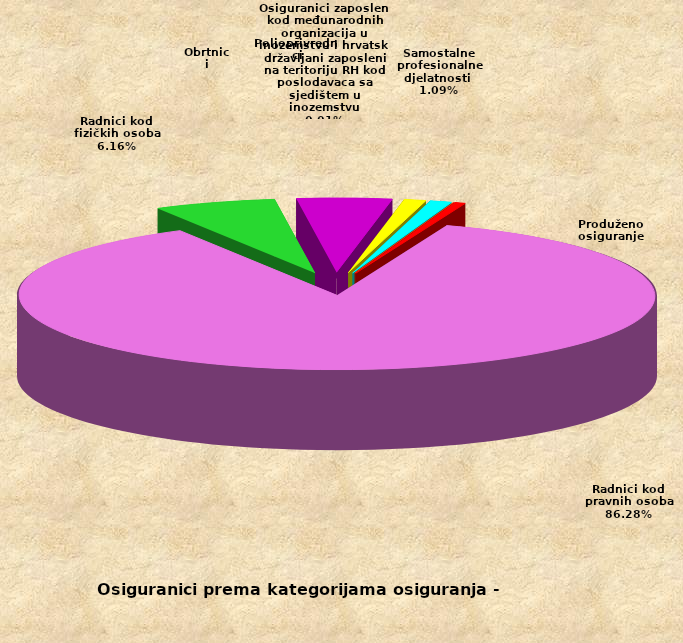
| Category | Series 0 |
|---|---|
| Radnici kod pravnih osoba | 1420613 |
| Radnici kod fizičkih osoba | 101388 |
| Obrtnici | 78999 |
| Poljoprivrednici | 18319 |
| Samostalne profesionalne djelatnosti  | 17951 |
| Osiguranici zaposleni kod međunarodnih organizacija u inozemstvu i hrvatski državljani zaposleni na teritoriju RH kod poslodavaca sa sjedištem u inozemstvu | 175 |
| Produženo osiguranje | 9095 |